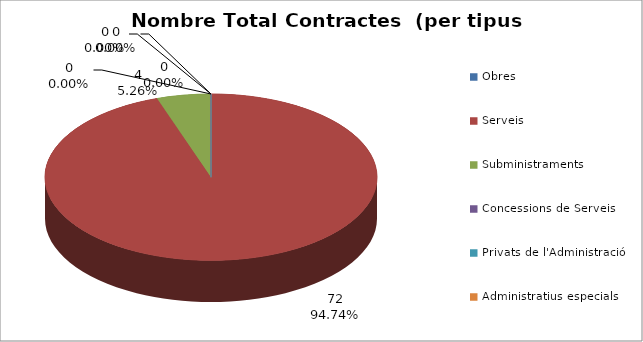
| Category | Nombre Total Contractes |
|---|---|
| Obres | 0 |
| Serveis | 72 |
| Subministraments | 4 |
| Concessions de Serveis | 0 |
| Privats de l'Administració | 0 |
| Administratius especials | 0 |